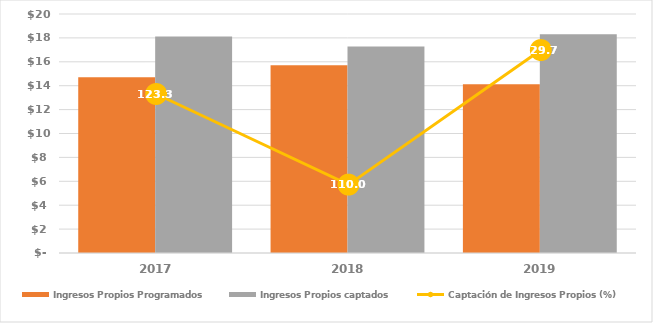
| Category | Ingresos Propios Programados | Ingresos Propios captados |
|---|---|---|
| 2017.0 | 14703.3 | 18126.744 |
| 2018.0 | 15714.18 | 17287.697 |
| 2019.0 | 14115.571 | 18310.548 |